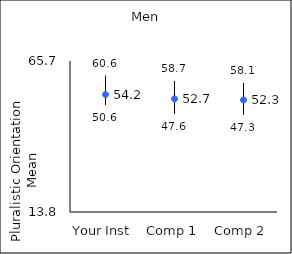
| Category | 25th percentile | 75th percentile | Mean |
|---|---|---|---|
| Your Inst | 50.6 | 60.6 | 54.17 |
| Comp 1 | 47.6 | 58.7 | 52.7 |
| Comp 2 | 47.3 | 58.1 | 52.32 |